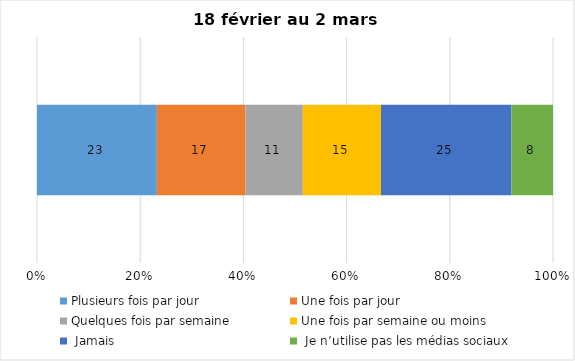
| Category | Plusieurs fois par jour | Une fois par jour | Quelques fois par semaine   | Une fois par semaine ou moins   |  Jamais   |  Je n’utilise pas les médias sociaux |
|---|---|---|---|---|---|---|
| 0 | 23 | 17 | 11 | 15 | 25 | 8 |